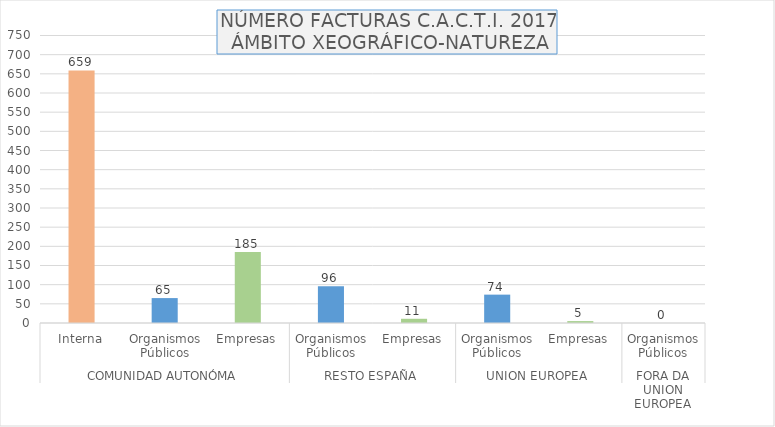
| Category | Series 0 |
|---|---|
| 0 | 659 |
| 1 | 65 |
| 2 | 185 |
| 3 | 96 |
| 4 | 11 |
| 5 | 74 |
| 6 | 5 |
| 7 | 0 |